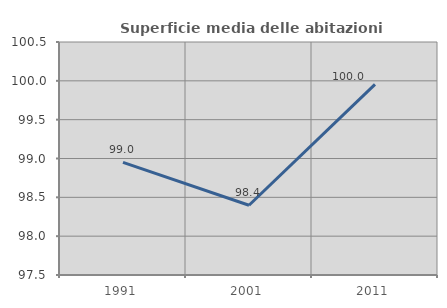
| Category | Superficie media delle abitazioni occupate |
|---|---|
| 1991.0 | 98.951 |
| 2001.0 | 98.398 |
| 2011.0 | 99.953 |